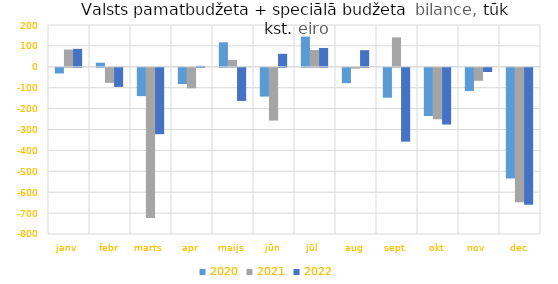
| Category | 2020 | 2021 | 2022 |
|---|---|---|---|
| janv | -27208.622 | 82687.376 | 85977.566 |
| febr | 19788.686 | -71897.87 | -91449.582 |
| marts | -135656.538 | -718456.648 | -317726.304 |
| apr | -77693.159 | -98266.92 | 4462.198 |
| maijs | 117283.375 | 33166.776 | -158594.854 |
| jūn | -137664.742 | -252544.202 | 62199.471 |
| jūl | 144716.055 | 80130.309 | 89874.872 |
| aug | -73544.568 | -3849.803 | 79584.039 |
| sept | -143217.051 | 140699.512 | -353345.335 |
| okt | -230687.141 | -246404.654 | -271420.986 |
| nov | -111188.747 | -62022.59 | -20014.95 |
| dec | -529219.01 | -643593.594 | -655267.986 |